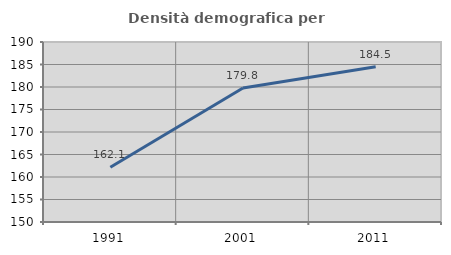
| Category | Densità demografica |
|---|---|
| 1991.0 | 162.149 |
| 2001.0 | 179.763 |
| 2011.0 | 184.494 |